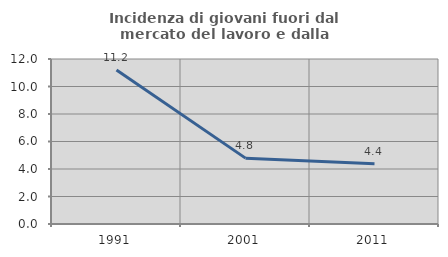
| Category | Incidenza di giovani fuori dal mercato del lavoro e dalla formazione  |
|---|---|
| 1991.0 | 11.194 |
| 2001.0 | 4.79 |
| 2011.0 | 4.386 |